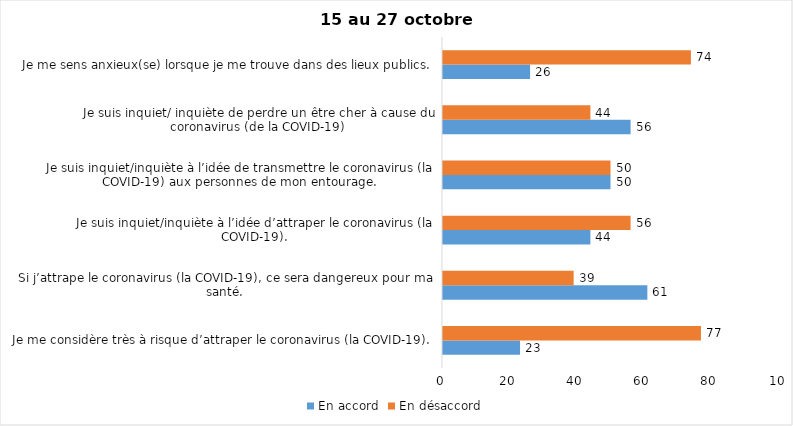
| Category | En accord | En désaccord |
|---|---|---|
| Je me considère très à risque d’attraper le coronavirus (la COVID-19). | 23 | 77 |
| Si j’attrape le coronavirus (la COVID-19), ce sera dangereux pour ma santé. | 61 | 39 |
| Je suis inquiet/inquiète à l’idée d’attraper le coronavirus (la COVID-19). | 44 | 56 |
| Je suis inquiet/inquiète à l’idée de transmettre le coronavirus (la COVID-19) aux personnes de mon entourage. | 50 | 50 |
| Je suis inquiet/ inquiète de perdre un être cher à cause du coronavirus (de la COVID-19) | 56 | 44 |
| Je me sens anxieux(se) lorsque je me trouve dans des lieux publics. | 26 | 74 |